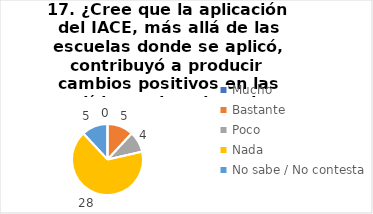
| Category | 17. ¿Cree que la aplicación del IACE, más allá de las escuelas donde se aplicó, contribuyó a producir cambios positivos en las políticas educativas de su provincia? |
|---|---|
| Mucho  | 0 |
| Bastante  | 0.119 |
| Poco  | 0.095 |
| Nada  | 0.667 |
| No sabe / No contesta | 0.119 |